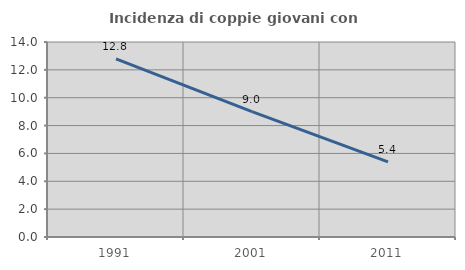
| Category | Incidenza di coppie giovani con figli |
|---|---|
| 1991.0 | 12.791 |
| 2001.0 | 9.006 |
| 2011.0 | 5.394 |